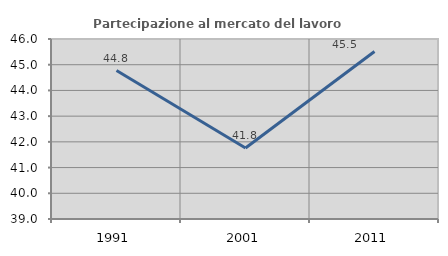
| Category | Partecipazione al mercato del lavoro  femminile |
|---|---|
| 1991.0 | 44.774 |
| 2001.0 | 41.758 |
| 2011.0 | 45.515 |